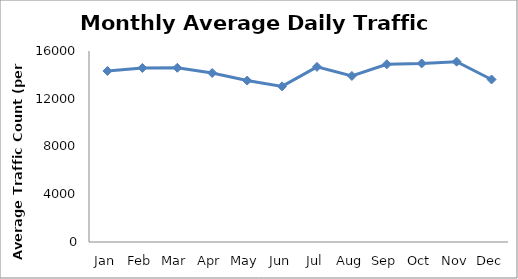
| Category | Series 0 |
|---|---|
| Jan | 14326.25 |
| Feb | 14581.25 |
| Mar | 14594 |
| Apr | 14156.75 |
| May | 13523.75 |
| Jun | 13037.5 |
| Jul | 14670.75 |
| Aug | 13912.5 |
| Sep | 14888.25 |
| Oct | 14958 |
| Nov | 15106.5 |
| Dec | 13615 |